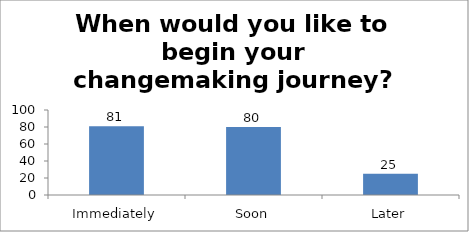
| Category | When would you like to begin your changemaking journey?  |
|---|---|
| Immediately | 81 |
| Soon | 80 |
| Later | 25 |